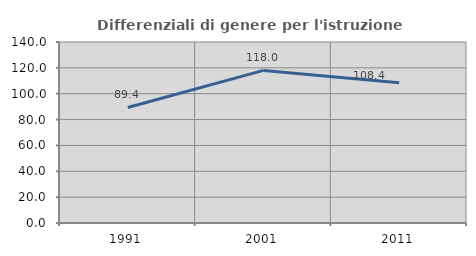
| Category | Differenziali di genere per l'istruzione superiore |
|---|---|
| 1991.0 | 89.358 |
| 2001.0 | 118.03 |
| 2011.0 | 108.443 |